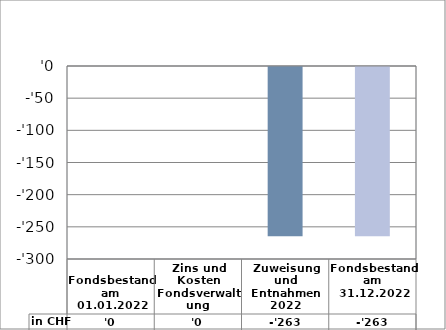
| Category | in CHF |
|---|---|
| 
Fondsbestand am 01.01.2022

 | 0 |
| Zins und Kosten Fondsverwaltung | 0 |
| Zuweisung und Entnahmen 2022 | -262.9 |
| Fondsbestand am 31.12.2022 | -262.9 |